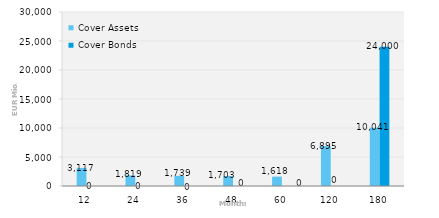
| Category | Cover Assets | Cover Bonds |
|---|---|---|
| 12.0 | 3116.566 | 0 |
| 24.0 | 1818.914 | 0 |
| 36.0 | 1739.354 | 0 |
| 48.0 | 1702.71 | 0 |
| 60.0 | 1618.016 | 0 |
| 120.0 | 6894.677 | 0 |
| 180.0 | 10041.304 | 24000 |